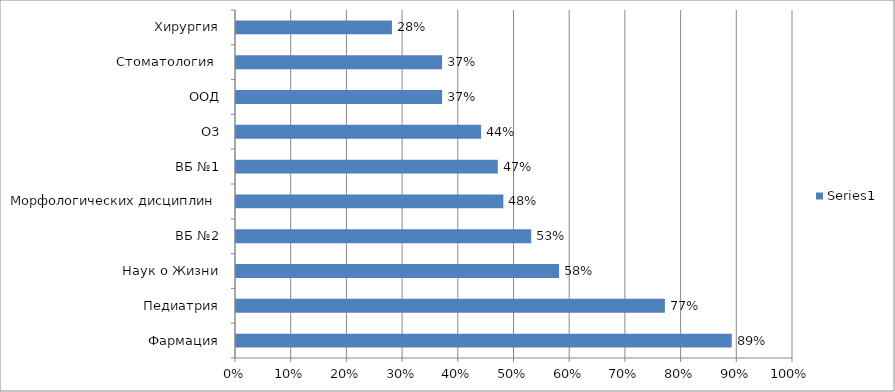
| Category | Series 0 |
|---|---|
| Фармация | 0.89 |
| Педиатрия | 0.77 |
| Наук о Жизни | 0.58 |
| ВБ №2 | 0.53 |
| Морфологических дисциплин | 0.48 |
| ВБ №1 | 0.47 |
| ОЗ | 0.44 |
| ООД | 0.37 |
| Стоматология  | 0.37 |
| Хирургия | 0.28 |